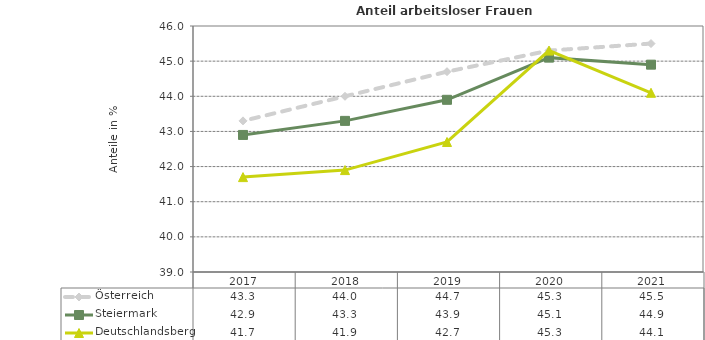
| Category | Österreich | Steiermark | Deutschlandsberg |
|---|---|---|---|
| 2021.0 | 45.5 | 44.9 | 44.1 |
| 2020.0 | 45.3 | 45.1 | 45.3 |
| 2019.0 | 44.7 | 43.9 | 42.7 |
| 2018.0 | 44 | 43.3 | 41.9 |
| 2017.0 | 43.3 | 42.9 | 41.7 |